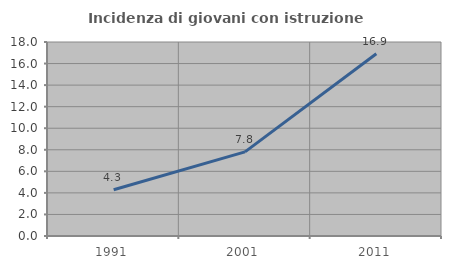
| Category | Incidenza di giovani con istruzione universitaria |
|---|---|
| 1991.0 | 4.289 |
| 2001.0 | 7.81 |
| 2011.0 | 16.912 |